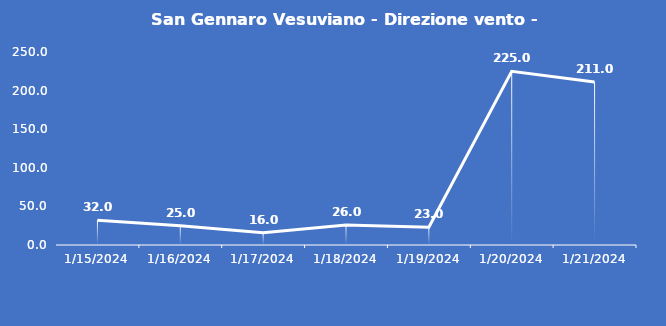
| Category | San Gennaro Vesuviano - Direzione vento - Grezzo (°N) |
|---|---|
| 1/15/24 | 32 |
| 1/16/24 | 25 |
| 1/17/24 | 16 |
| 1/18/24 | 26 |
| 1/19/24 | 23 |
| 1/20/24 | 225 |
| 1/21/24 | 211 |